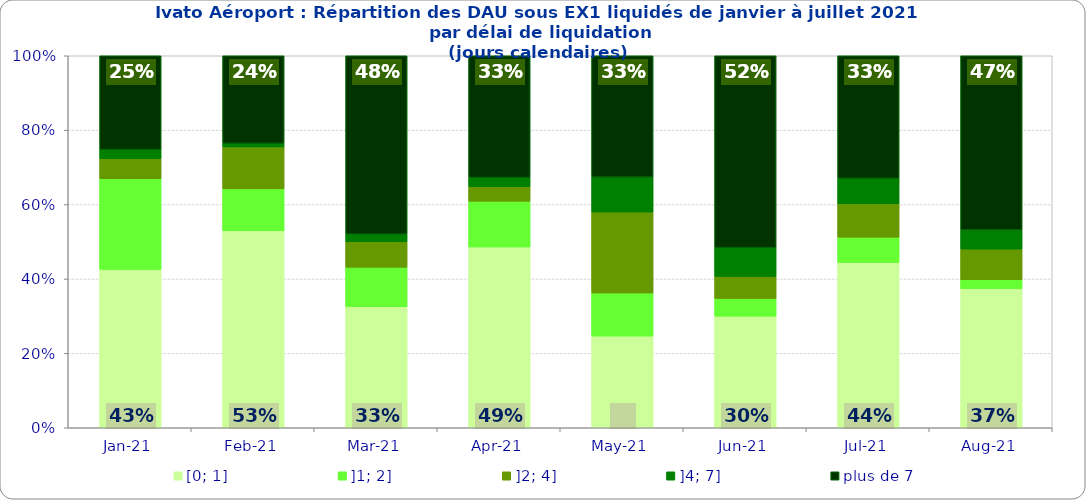
| Category | [0; 1] | ]1; 2] | ]2; 4] | ]4; 7] | plus de 7 |
|---|---|---|---|---|---|
| 2021-01-01 | 0.426 | 0.244 | 0.054 | 0.025 | 0.252 |
| 2021-02-01 | 0.529 | 0.113 | 0.113 | 0.01 | 0.235 |
| 2021-03-01 | 0.325 | 0.106 | 0.068 | 0.021 | 0.479 |
| 2021-04-01 | 0.486 | 0.123 | 0.039 | 0.025 | 0.327 |
| 2021-05-01 | 0.246 | 0.116 | 0.217 | 0.094 | 0.326 |
| 2021-06-01 | 0.3 | 0.048 | 0.059 | 0.077 | 0.516 |
| 2021-07-01 | 0.444 | 0.068 | 0.09 | 0.068 | 0.329 |
| 2021-08-01 | 0.374 | 0.024 | 0.082 | 0.052 | 0.468 |